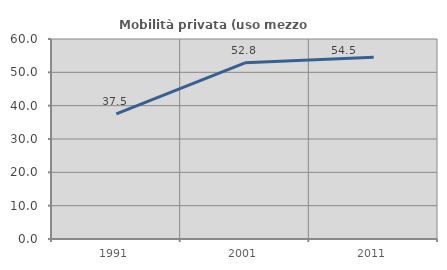
| Category | Mobilità privata (uso mezzo privato) |
|---|---|
| 1991.0 | 37.533 |
| 2001.0 | 52.838 |
| 2011.0 | 54.545 |